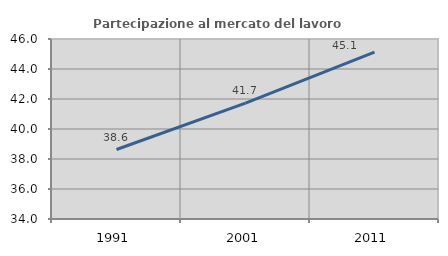
| Category | Partecipazione al mercato del lavoro  femminile |
|---|---|
| 1991.0 | 38.632 |
| 2001.0 | 41.725 |
| 2011.0 | 45.121 |